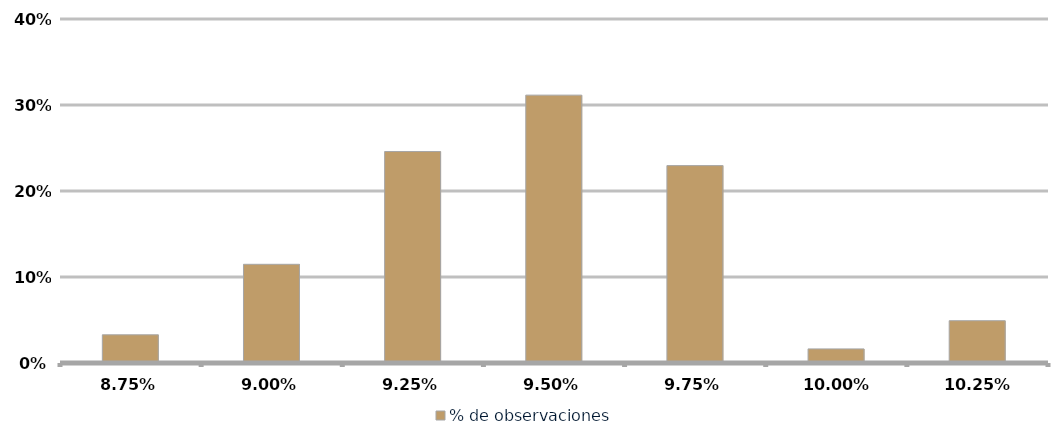
| Category | % de observaciones  |
|---|---|
| 0.0875 | 0.033 |
| 0.09 | 0.115 |
| 0.0925 | 0.246 |
| 0.095 | 0.311 |
| 0.0975 | 0.23 |
| 0.1 | 0.016 |
| 0.10250000000000001 | 0.049 |